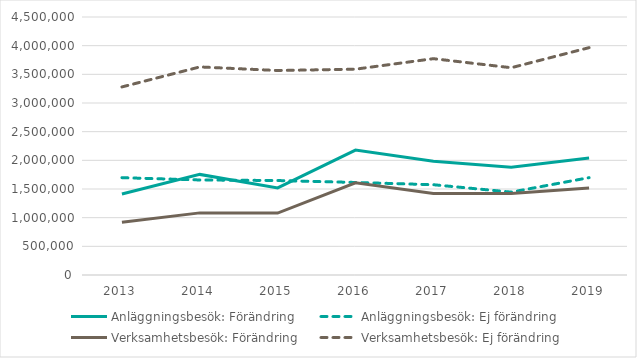
| Category | Anläggningsbesök: Förändring | Anläggningsbesök: Ej förändring | Verksamhetsbesök: Förändring | Verksamhetsbesök: Ej förändring |
|---|---|---|---|---|
| 2013 | 1413763 | 1697321 | 919305 | 3280238 |
| 2014 | 1754669 | 1657555 | 1083486 | 3629077 |
| 2015 | 1519619 | 1647586 | 1079529 | 3566683 |
| 2016 | 2177957 | 1614164 | 1606847 | 3590016 |
| 2017 | 1983149 | 1574784 | 1422289 | 3773086 |
| 2018 | 1877563 | 1445524 | 1422819 | 3615251 |
| 2019 | 2041110 | 1697831 | 1516115 | 3965357 |